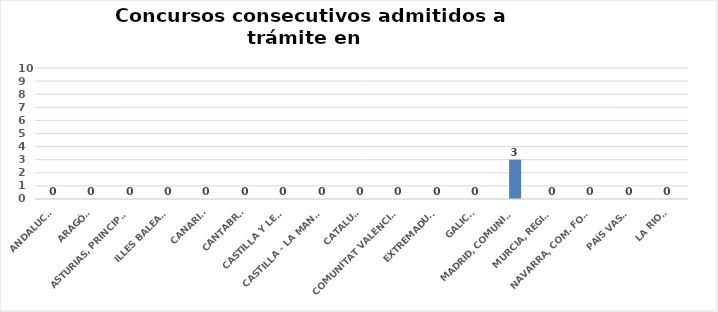
| Category | Series 0 |
|---|---|
| ANDALUCÍA | 0 |
| ARAGÓN | 0 |
| ASTURIAS, PRINCIPADO | 0 |
| ILLES BALEARS | 0 |
| CANARIAS | 0 |
| CANTABRIA | 0 |
| CASTILLA Y LEÓN | 0 |
| CASTILLA - LA MANCHA | 0 |
| CATALUÑA | 0 |
| COMUNITAT VALENCIANA | 0 |
| EXTREMADURA | 0 |
| GALICIA | 0 |
| MADRID, COMUNIDAD | 3 |
| MURCIA, REGIÓN | 0 |
| NAVARRA, COM. FORAL | 0 |
| PAÍS VASCO | 0 |
| LA RIOJA | 0 |